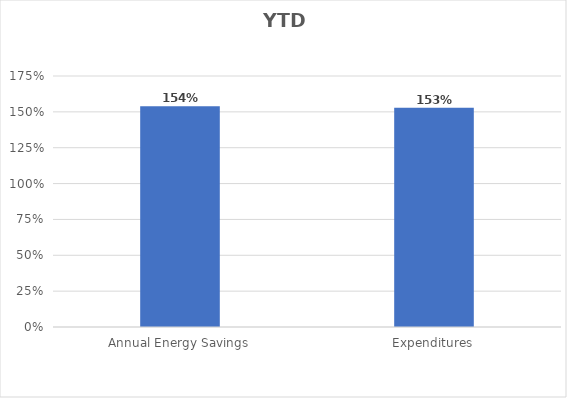
| Category | Series 0 |
|---|---|
| Annual Energy Savings | 1.538 |
| Expenditures | 1.529 |